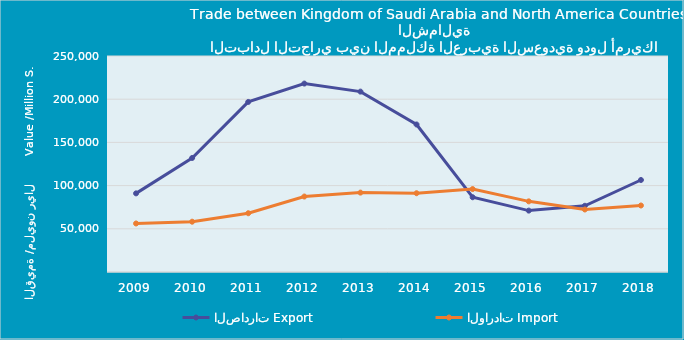
| Category | الصادرات | الواردات |
|---|---|---|
| 2009.0 | 91014328897 | 56167416990 |
| 2010.0 | 131997284899 | 58216407588 |
| 2011.0 | 196844000203 | 68009808566 |
| 2012.0 | 218096654598 | 87344142831 |
| 2013.0 | 208773756364 | 91884765827 |
| 2014.0 | 170750851869 | 91164839626 |
| 2015.0 | 86533127258 | 96000282289 |
| 2016.0 | 71054442501 | 81762572694 |
| 2017.0 | 76623459924 | 72347433070 |
| 2018.0 | 106492432186 | 76965156149 |